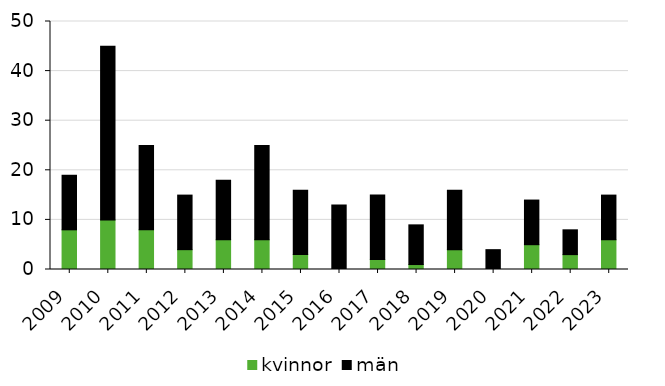
| Category | kvinnor | män |
|---|---|---|
| 2009 | 8 | 11 |
| 2010 | 10 | 35 |
| 2011 | 8 | 17 |
| 2012 | 4 | 11 |
| 2013 | 6 | 12 |
| 2014 | 6 | 19 |
| 2015 | 3 | 13 |
| 2016 | 0 | 13 |
| 2017 | 2 | 13 |
| 2018 | 1 | 8 |
| 2019 | 4 | 12 |
| 2020 | 0 | 4 |
| 2021 | 5 | 9 |
| 2022 | 3 | 5 |
| 2023 | 6 | 9 |